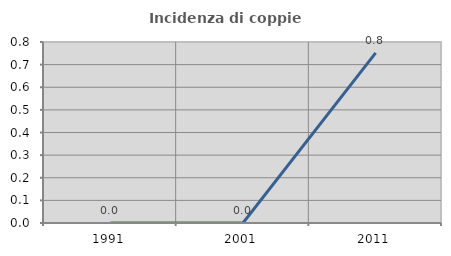
| Category | Incidenza di coppie miste |
|---|---|
| 1991.0 | 0 |
| 2001.0 | 0 |
| 2011.0 | 0.752 |